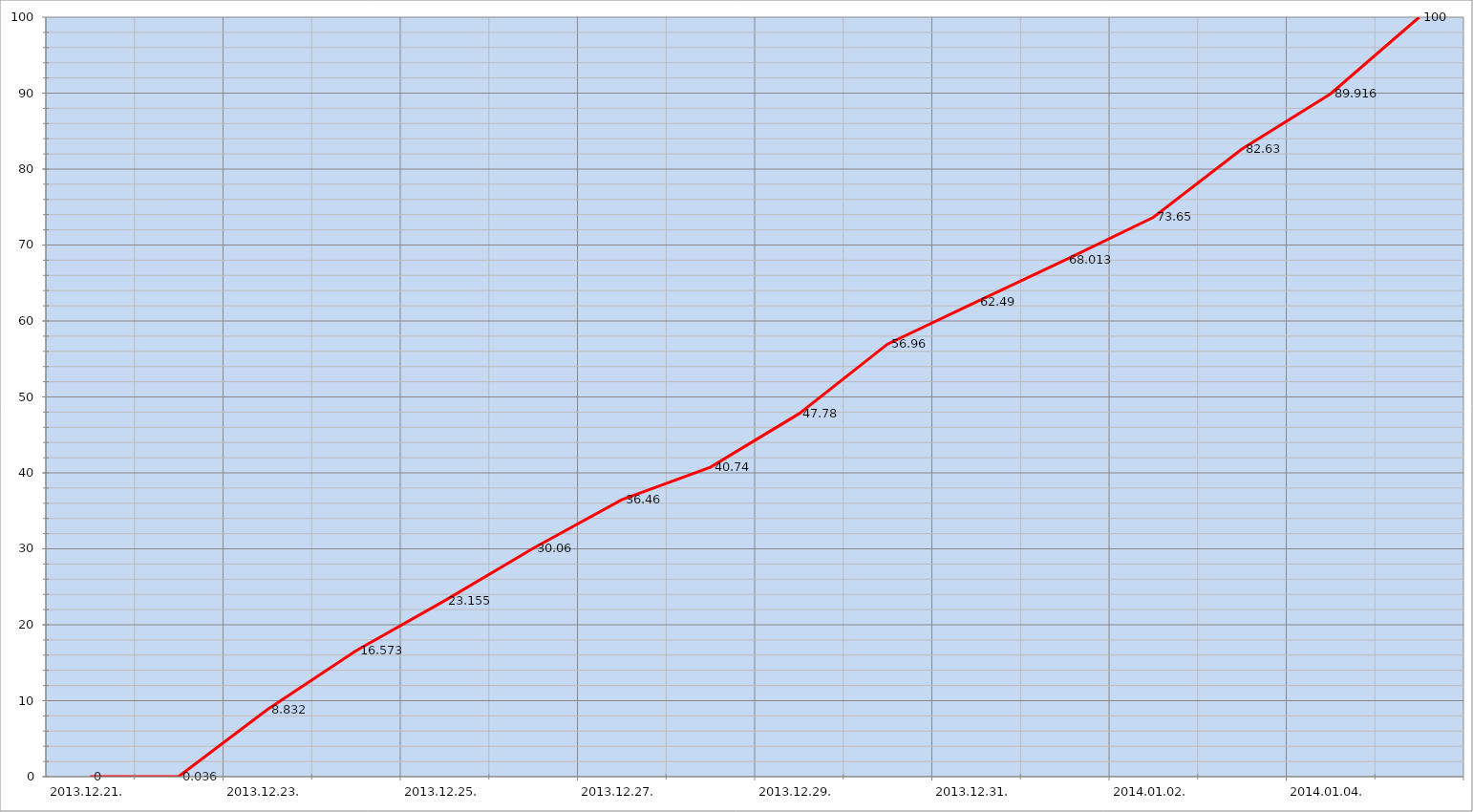
| Category | Szerver 5 |
|---|---|
| 2013-12-21 | 0 |
| 2013-12-22 | 0.036 |
| 2013-12-23 | 8.832 |
| 2013-12-24 | 16.573 |
| 2013-12-25 | 23.155 |
| 2013-12-26 | 30.06 |
| 2013-12-27 | 36.46 |
| 2013-12-28 | 40.74 |
| 2013-12-29 | 47.78 |
| 2013-12-30 | 56.96 |
| 2013-12-31 | 62.49 |
| 2014-01-01 | 68.013 |
| 2014-01-02 | 73.65 |
| 2014-01-03 | 82.63 |
| 2014-01-04 | 89.916 |
| 2014-01-05 | 100 |